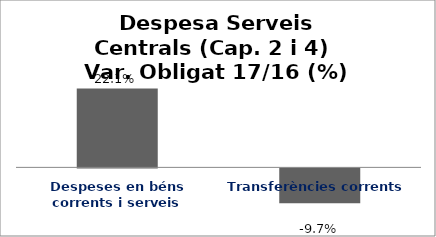
| Category | Series 0 |
|---|---|
| Despeses en béns corrents i serveis | 0.221 |
| Transferències corrents | -0.097 |